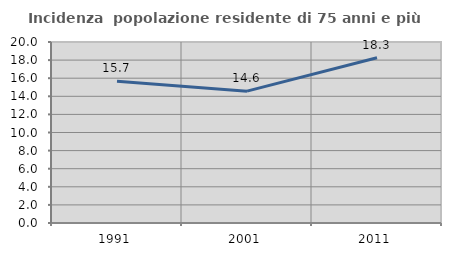
| Category | Incidenza  popolazione residente di 75 anni e più |
|---|---|
| 1991.0 | 15.672 |
| 2001.0 | 14.567 |
| 2011.0 | 18.254 |